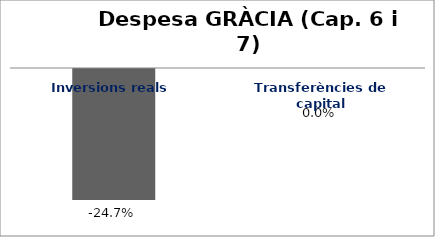
| Category | Series 0 |
|---|---|
| Inversions reals | -0.247 |
| Transferències de capital | 0 |